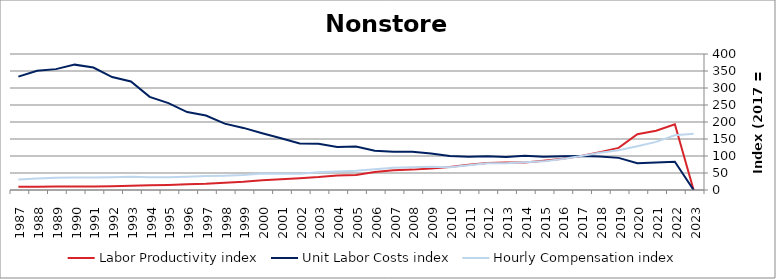
| Category | Labor Productivity index | Unit Labor Costs index | Hourly Compensation index |
|---|---|---|---|
| 2023.0 | 0 | 0 | 165.223 |
| 2022.0 | 193.514 | 83.166 | 160.937 |
| 2021.0 | 174.455 | 81.079 | 141.447 |
| 2020.0 | 164.143 | 78.567 | 128.962 |
| 2019.0 | 123.829 | 94.504 | 117.024 |
| 2018.0 | 111.42 | 98.398 | 109.635 |
| 2017.0 | 100 | 100 | 100 |
| 2016.0 | 91.934 | 99.273 | 91.265 |
| 2015.0 | 85.908 | 98.006 | 84.195 |
| 2014.0 | 81.071 | 100.823 | 81.738 |
| 2013.0 | 80.973 | 97.257 | 78.753 |
| 2012.0 | 79.223 | 99.621 | 78.923 |
| 2011.0 | 74.261 | 97.678 | 72.537 |
| 2010.0 | 67.312 | 99.898 | 67.243 |
| 2009.0 | 63.57 | 107.171 | 68.128 |
| 2008.0 | 59.93 | 112.244 | 67.268 |
| 2007.0 | 57.753 | 112.777 | 65.132 |
| 2006.0 | 53.033 | 115.641 | 61.328 |
| 2005.0 | 44.306 | 128.124 | 56.767 |
| 2004.0 | 42.936 | 126.436 | 54.287 |
| 2003.0 | 38.228 | 136.282 | 52.098 |
| 2002.0 | 34.789 | 137.097 | 47.695 |
| 2001.0 | 31.294 | 152.305 | 47.662 |
| 2000.0 | 29.014 | 166.837 | 48.407 |
| 1999.0 | 24.323 | 182.608 | 44.415 |
| 1998.0 | 21.624 | 195.29 | 42.229 |
| 1997.0 | 18.713 | 219.085 | 40.998 |
| 1996.0 | 17.067 | 229.266 | 39.129 |
| 1995.0 | 14.806 | 255.471 | 37.826 |
| 1994.0 | 13.7 | 273.865 | 37.521 |
| 1993.0 | 12.134 | 319.052 | 38.713 |
| 1992.0 | 11.201 | 332.255 | 37.216 |
| 1991.0 | 10.236 | 360.111 | 36.862 |
| 1990.0 | 9.973 | 368.713 | 36.772 |
| 1989.0 | 10.049 | 355.495 | 35.722 |
| 1988.0 | 9.658 | 350.786 | 33.88 |
| 1987.0 | 9.237 | 333.447 | 30.8 |